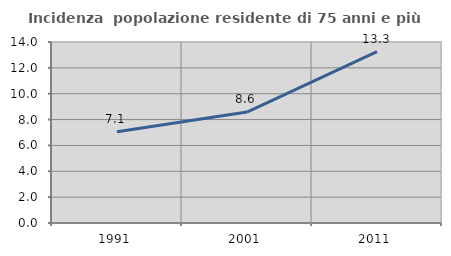
| Category | Incidenza  popolazione residente di 75 anni e più |
|---|---|
| 1991.0 | 7.062 |
| 2001.0 | 8.578 |
| 2011.0 | 13.256 |